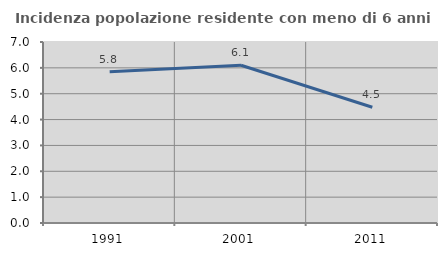
| Category | Incidenza popolazione residente con meno di 6 anni |
|---|---|
| 1991.0 | 5.845 |
| 2001.0 | 6.1 |
| 2011.0 | 4.476 |